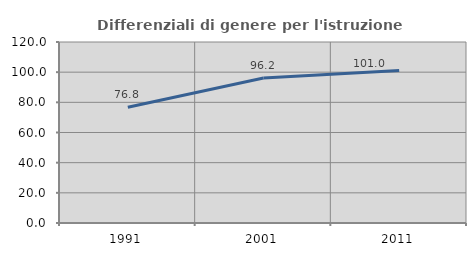
| Category | Differenziali di genere per l'istruzione superiore |
|---|---|
| 1991.0 | 76.772 |
| 2001.0 | 96.154 |
| 2011.0 | 101.037 |